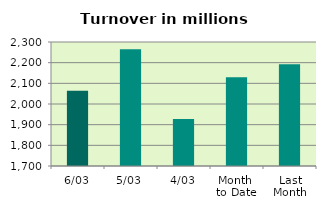
| Category | Series 0 |
|---|---|
| 6/03 | 2064.3 |
| 5/03 | 2265.08 |
| 4/03 | 1927.995 |
| Month 
to Date | 2130.009 |
| Last
Month | 2191.938 |